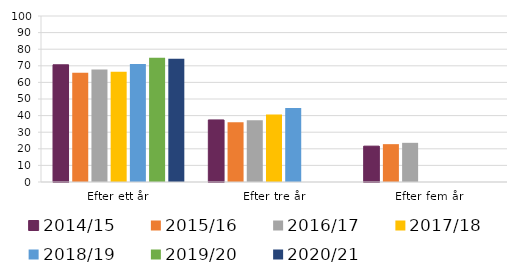
| Category | 2014/15 | 2015/16 | 2016/17 | 2017/18 | 2018/19 | 2019/20 | 2020/21 |
|---|---|---|---|---|---|---|---|
| Efter ett år | 70.6 | 65.8 | 67.8 | 66.4 | 71.1 | 74.8 | 74.3 |
| Efter tre år | 37.4 | 36 | 37.2 | 40.7 | 44.6 | 0 | 0 |
| Efter fem år | 21.6 | 22.8 | 23.6 | 0 | 0 | 0 | 0 |